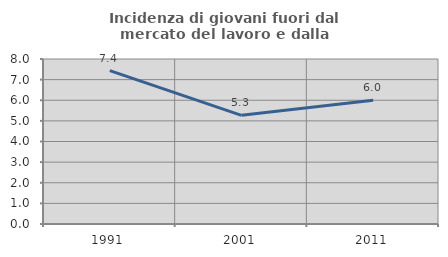
| Category | Incidenza di giovani fuori dal mercato del lavoro e dalla formazione  |
|---|---|
| 1991.0 | 7.438 |
| 2001.0 | 5.267 |
| 2011.0 | 6.003 |